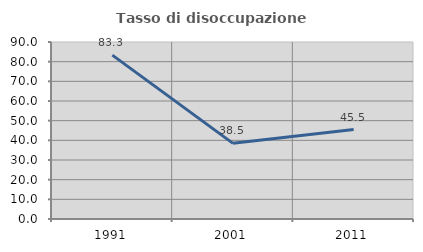
| Category | Tasso di disoccupazione giovanile  |
|---|---|
| 1991.0 | 83.333 |
| 2001.0 | 38.462 |
| 2011.0 | 45.455 |